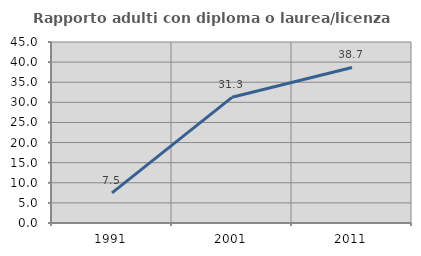
| Category | Rapporto adulti con diploma o laurea/licenza media  |
|---|---|
| 1991.0 | 7.5 |
| 2001.0 | 31.25 |
| 2011.0 | 38.667 |